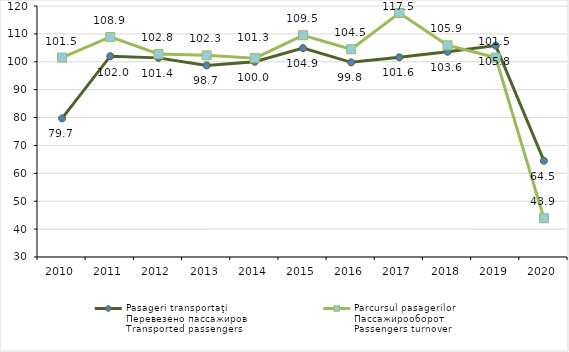
| Category | Pasageri transportaţi
Перевезено пассажиpов
Transported passengers  | Parcursul pasagerilor
Пассажиpообоpот
Passengers turnover |
|---|---|---|
| 2010.0 | 79.7 | 101.5 |
| 2011.0 | 102 | 108.9 |
| 2012.0 | 101.4 | 102.8 |
| 2013.0 | 98.7 | 102.3 |
| 2014.0 | 100 | 101.3 |
| 2015.0 | 104.9 | 109.5 |
| 2016.0 | 99.8 | 104.5 |
| 2017.0 | 101.6 | 117.5 |
| 2018.0 | 103.6 | 105.9 |
| 2019.0 | 105.8 | 101.5 |
| 2020.0 | 64.5 | 43.9 |